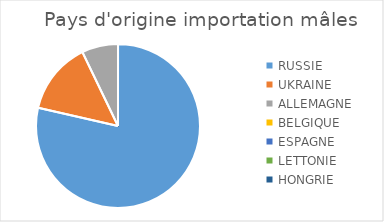
| Category | Series 0 |
|---|---|
| RUSSIE | 11 |
| UKRAINE | 2 |
| ALLEMAGNE | 1 |
| BELGIQUE | 0 |
| ESPAGNE | 0 |
| LETTONIE | 0 |
| HONGRIE | 0 |